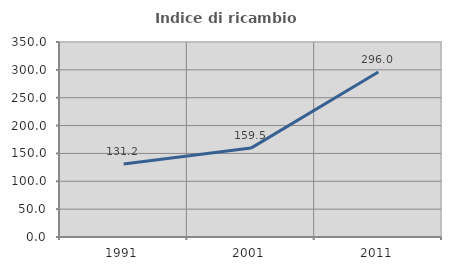
| Category | Indice di ricambio occupazionale  |
|---|---|
| 1991.0 | 131.159 |
| 2001.0 | 159.542 |
| 2011.0 | 296 |